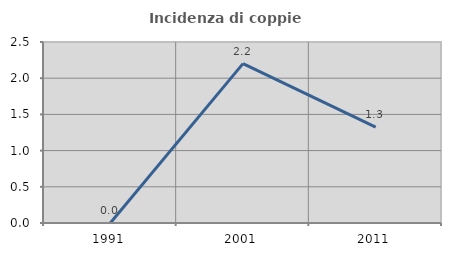
| Category | Incidenza di coppie miste |
|---|---|
| 1991.0 | 0 |
| 2001.0 | 2.201 |
| 2011.0 | 1.325 |